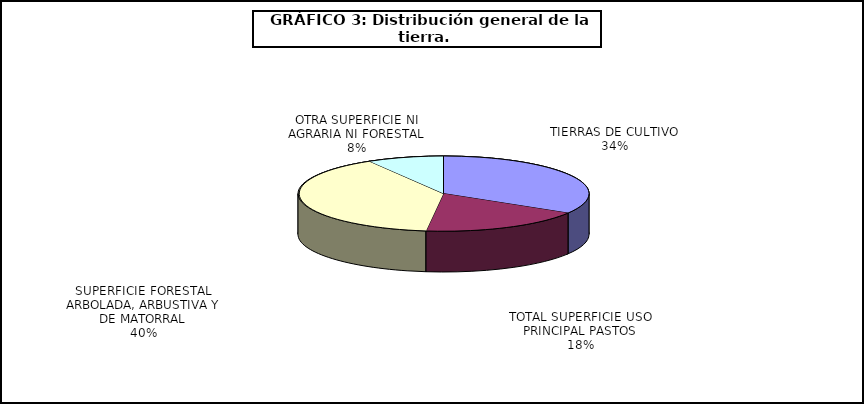
| Category | Series 0 |
|---|---|
| TIERRAS DE CULTIVO | 17033007 |
| TOTAL SUPERFICIE USO PRINCIPAL PASTOS | 9232689 |
| SUPERFICIE FORESTAL ARBOLADA, ARBUSTIVA Y DE MATORRAL | 20032381 |
| OTRA SUPERFICIE NI AGRARIA NI FORESTAL | 4295468 |